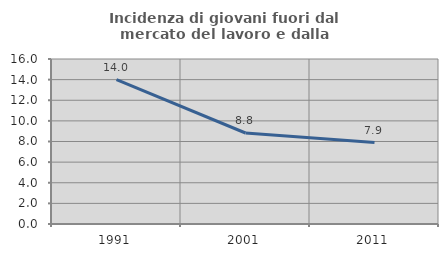
| Category | Incidenza di giovani fuori dal mercato del lavoro e dalla formazione  |
|---|---|
| 1991.0 | 14 |
| 2001.0 | 8.824 |
| 2011.0 | 7.895 |